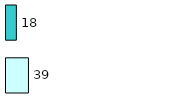
| Category | Series 0 | Series 1 |
|---|---|---|
| 0 | 39 | 18 |